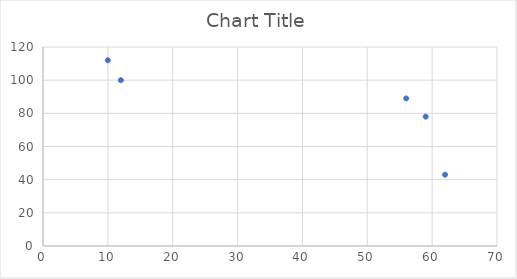
| Category | Series 0 |
|---|---|
| 10.0 | 112 |
| 12.0 | 100 |
| 56.0 | 89 |
| 59.0 | 78 |
| 62.0 | 43 |